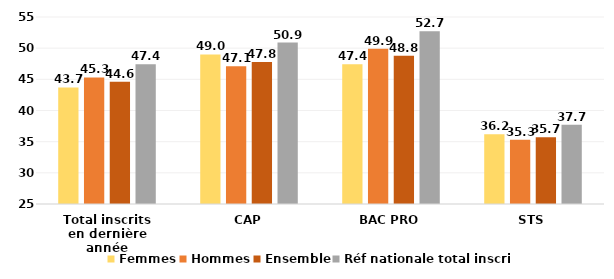
| Category | Femmes | Hommes | Ensemble | Réf nationale total inscrits |
|---|---|---|---|---|
| Total inscrits en dernière année | 43.7 | 45.3 | 44.6 | 47.4 |
| CAP | 49 | 47.1 | 47.8 | 50.9 |
| BAC PRO | 47.4 | 49.9 | 48.8 | 52.7 |
| STS | 36.2 | 35.3 | 35.7 | 37.7 |